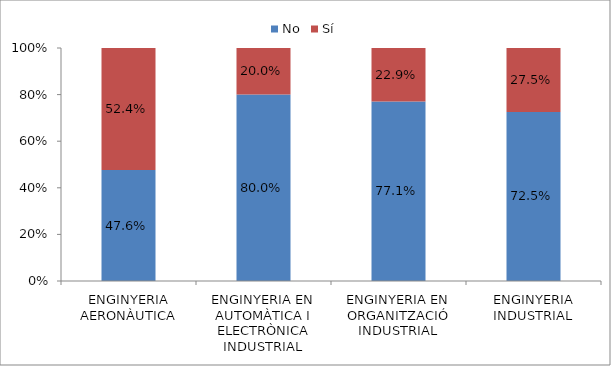
| Category | No | Sí |
|---|---|---|
| ENGINYERIA AERONÀUTICA | 0.476 | 0.524 |
| ENGINYERIA EN AUTOMÀTICA I ELECTRÒNICA INDUSTRIAL | 0.8 | 0.2 |
| ENGINYERIA EN ORGANITZACIÓ INDUSTRIAL | 0.771 | 0.229 |
| ENGINYERIA INDUSTRIAL | 0.725 | 0.275 |